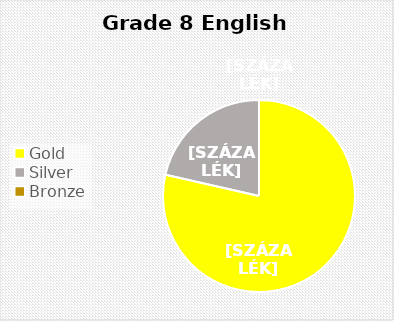
| Category | Series 0 |
|---|---|
| Gold | 11 |
| Silver | 3 |
| Bronze  | 0 |